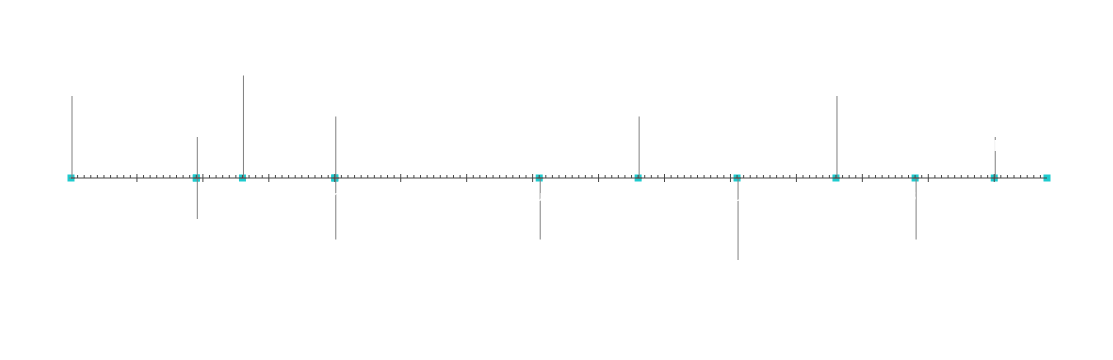
| Category | Poziție |
|---|---|
| Început proiect | 20 |
| Jalon 1 | 10 |
| Jalon 2 | -10 |
| Jalon 3 | 25 |
| Jalon 4 | -15 |
| Jalon 5 | 15 |
| Jalon 6 | -15 |
| Jalon 7 | 15 |
| Jalon 8 | -20 |
| Jalon 9 | 20 |
| Jalon 10 | -15 |
| Jalon 11 | 10 |
| Sfârșit proiect | 5 |